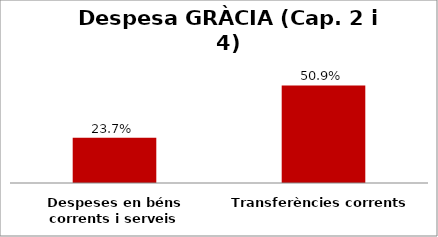
| Category | Series 0 |
|---|---|
| Despeses en béns corrents i serveis | 0.237 |
| Transferències corrents | 0.509 |